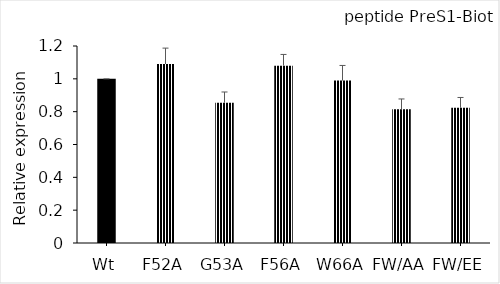
| Category | Series 0 |
|---|---|
| Wt | 1 |
| F52A | 1.09 |
| G53A | 0.854 |
| F56A | 1.08 |
| W66A | 0.989 |
| FW/AA | 0.815 |
| FW/EE | 0.824 |